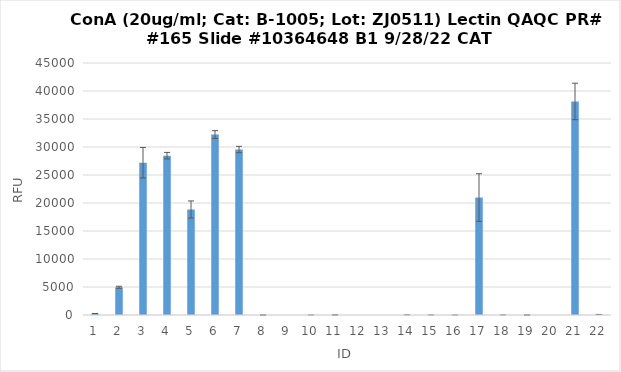
| Category | RFU |
|---|---|
| 0 | 245.75 |
| 1 | 4950.5 |
| 2 | 27191.25 |
| 3 | 28451.75 |
| 4 | 18843 |
| 5 | 32225.5 |
| 6 | 29549.25 |
| 7 | -0.5 |
| 8 | -1.5 |
| 9 | 1.25 |
| 10 | 22.5 |
| 11 | -5.75 |
| 12 | -1.75 |
| 13 | 12.5 |
| 14 | 4.5 |
| 15 | 0.75 |
| 16 | 20975 |
| 17 | 6 |
| 18 | 3.5 |
| 19 | -7 |
| 20 | 38134.5 |
| 21 | 92.5 |